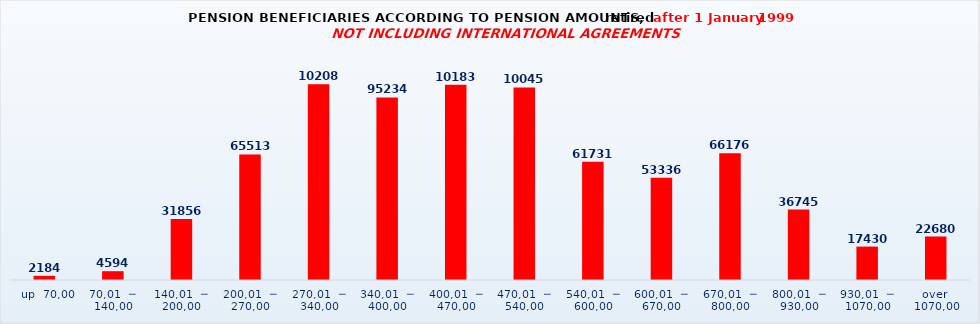
| Category | Series 0 |
|---|---|
|   up  70,00 | 2184 |
| 70,01  ─  140,00 | 4594 |
| 140,01  ─  200,00 | 31856 |
| 200,01  ─  270,00 | 65513 |
| 270,01  ─  340,00 | 102082 |
| 340,01  ─  400,00 | 95234 |
| 400,01  ─  470,00 | 101830 |
| 470,01  ─  540,00 | 100458 |
| 540,01  ─  600,00 | 61731 |
| 600,01  ─  670,00 | 53336 |
| 670,01  ─  800,00 | 66176 |
| 800,01  ─  930,00 | 36745 |
| 930,01  ─  1070,00 | 17430 |
| over  1070,00 | 22680 |